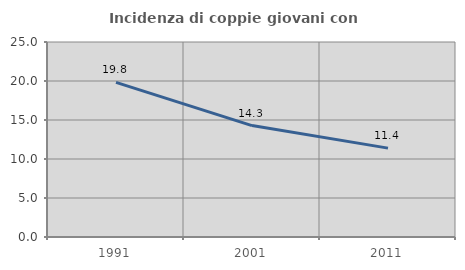
| Category | Incidenza di coppie giovani con figli |
|---|---|
| 1991.0 | 19.83 |
| 2001.0 | 14.286 |
| 2011.0 | 11.393 |